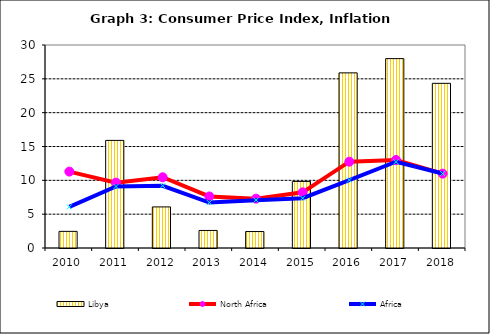
| Category | Libya |
|---|---|
| 2010.0 | 2.458 |
| 2011.0 | 15.902 |
| 2012.0 | 6.072 |
| 2013.0 | 2.594 |
| 2014.0 | 2.433 |
| 2015.0 | 9.839 |
| 2016.0 | 25.881 |
| 2017.0 | 27.988 |
| 2018.0 | 24.335 |